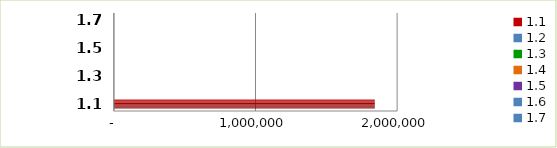
| Category | Series 0 |
|---|---|
| 1.1 | 1842325 |
| 1.2 | 0 |
| 1.3 | 0 |
| 1.4 | 0 |
| 1.5 | 0 |
| 1.6 | 0 |
| 1.7 | 0 |